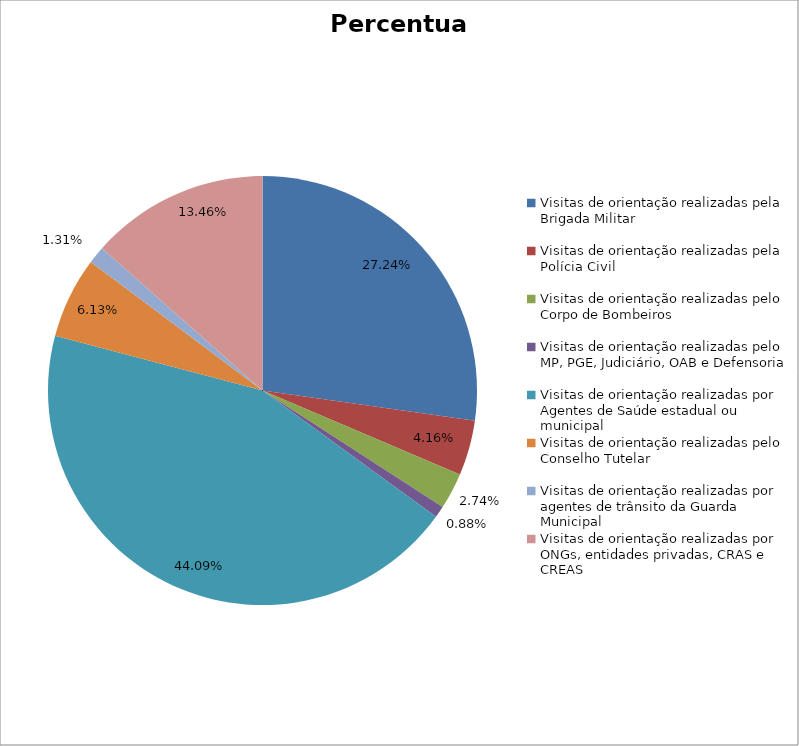
| Category | Percentual |
|---|---|
| Visitas de orientação realizadas pela Brigada Militar | 0.272 |
| Visitas de orientação realizadas pela Polícia Civil | 0.042 |
| Visitas de orientação realizadas pelo Corpo de Bombeiros | 0.027 |
| Visitas de orientação realizadas pelo MP, PGE, Judiciário, OAB e Defensoria | 0.009 |
| Visitas de orientação realizadas por Agentes de Saúde estadual ou municipal | 0.441 |
| Visitas de orientação realizadas pelo Conselho Tutelar | 0.061 |
| Visitas de orientação realizadas por agentes de trânsito da Guarda Municipal | 0.013 |
| Visitas de orientação realizadas por ONGs, entidades privadas, CRAS e CREAS | 0.135 |